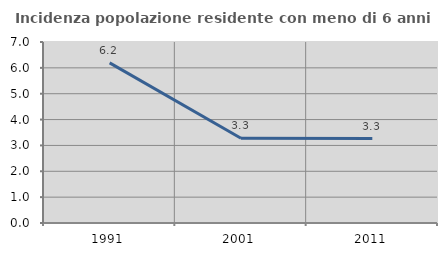
| Category | Incidenza popolazione residente con meno di 6 anni |
|---|---|
| 1991.0 | 6.192 |
| 2001.0 | 3.276 |
| 2011.0 | 3.266 |